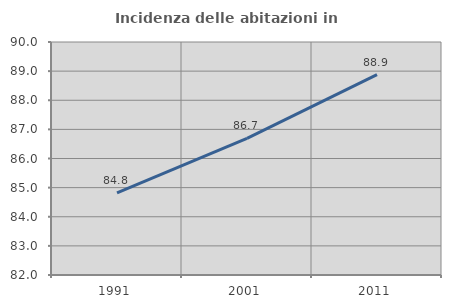
| Category | Incidenza delle abitazioni in proprietà  |
|---|---|
| 1991.0 | 84.82 |
| 2001.0 | 86.69 |
| 2011.0 | 88.881 |